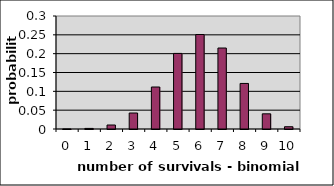
| Category | Series 1 |
|---|---|
| 0.0 | 0 |
| 1.0 | 0.002 |
| 2.0 | 0.011 |
| 3.0 | 0.042 |
| 4.0 | 0.111 |
| 5.0 | 0.201 |
| 6.0 | 0.251 |
| 7.0 | 0.215 |
| 8.0 | 0.121 |
| 9.0 | 0.04 |
| 10.0 | 0.006 |